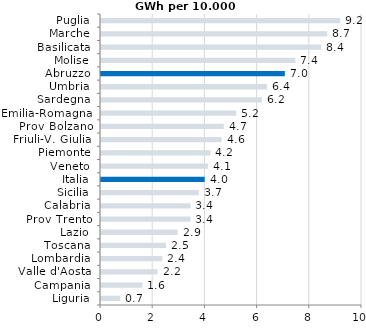
| Category | Series 0 |
|---|---|
| Liguria | 0.739 |
| Campania | 1.588 |
| Valle d'Aosta | 2.167 |
| Lombardia | 2.352 |
| Toscana | 2.49 |
| Lazio | 2.94 |
| Prov Trento | 3.429 |
| Calabria | 3.429 |
| Sicilia | 3.747 |
| Italia | 3.972 |
| Veneto | 4.098 |
| Piemonte | 4.194 |
| Friuli-V. Giulia | 4.621 |
| Prov Bolzano | 4.705 |
| Emilia-Romagna | 5.179 |
| Sardegna | 6.161 |
| Umbria | 6.36 |
| Abruzzo | 7.044 |
| Molise | 7.447 |
| Basilicata | 8.434 |
| Marche | 8.666 |
| Puglia | 9.161 |